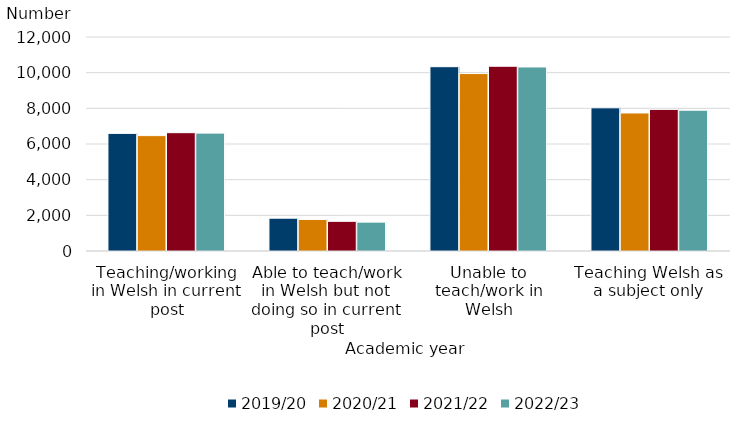
| Category | 2019/20 | 2020/21 | 2021/22 | 2022/23 |
|---|---|---|---|---|
| Teaching/working in Welsh in current post | 6595 | 6470 | 6635 | 6610 |
| Able to teach/work in Welsh but not doing so in current post | 1840 | 1770 | 1665 | 1620 |
| Unable to teach/work in Welsh | 10335 | 9950 | 10360 | 10320 |
| Teaching Welsh as a subject only | 8030 | 7740 | 7940 | 7895 |